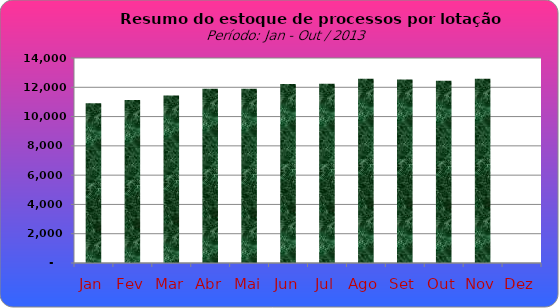
| Category | Series 0 |
|---|---|
| Jan | 10909 |
| Fev | 11131 |
| Mar | 11446 |
| Abr | 11893 |
| Mai | 11901 |
| Jun | 12228 |
| Jul | 12248 |
| Ago | 12576 |
| Set | 12532 |
| Out | 12450 |
| Nov | 12580 |
| Dez | 0 |